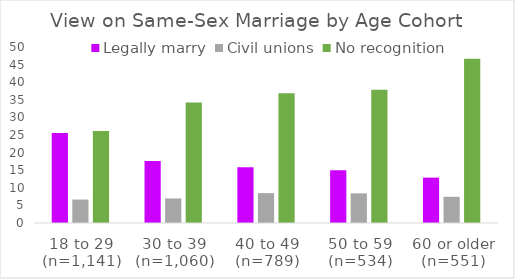
| Category | Legally marry | Civil unions | No recognition |
|---|---|---|---|
| 18 to 29
(n=1,141) | 25.59 | 6.66 | 26.12 |
| 30 to 39
(n=1,060) | 17.64 | 6.98 | 34.25 |
| 40 to 49
(n=789) | 15.84 | 8.49 | 36.88 |
| 50 to 59
(n=534) | 14.98 | 8.43 | 37.83 |
| 60 or older
(n=551) | 12.89 | 7.44 | 46.64 |